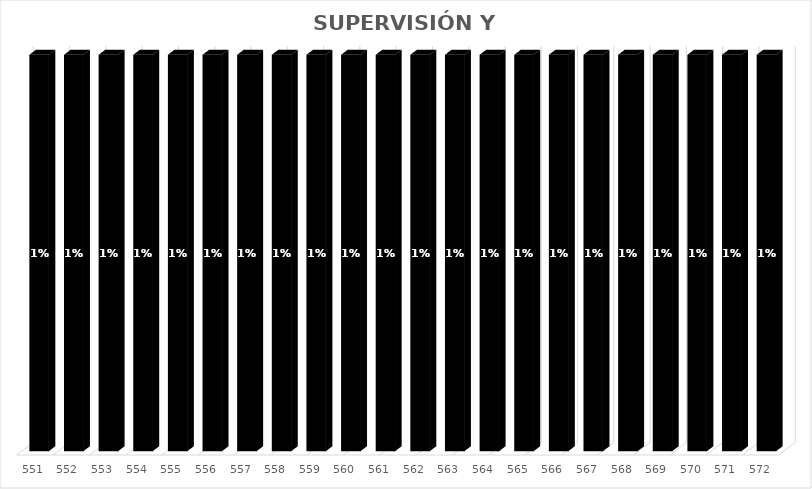
| Category | % Avance |
|---|---|
| 551.0 | 0.01 |
| 552.0 | 0.01 |
| 553.0 | 0.01 |
| 554.0 | 0.01 |
| 555.0 | 0.01 |
| 556.0 | 0.01 |
| 557.0 | 0.01 |
| 558.0 | 0.01 |
| 559.0 | 0.01 |
| 560.0 | 0.01 |
| 561.0 | 0.01 |
| 562.0 | 0.01 |
| 563.0 | 0.01 |
| 564.0 | 0.01 |
| 565.0 | 0.01 |
| 566.0 | 0.01 |
| 567.0 | 0.01 |
| 568.0 | 0.01 |
| 569.0 | 0.01 |
| 570.0 | 0.01 |
| 571.0 | 0.01 |
| 572.0 | 0.01 |